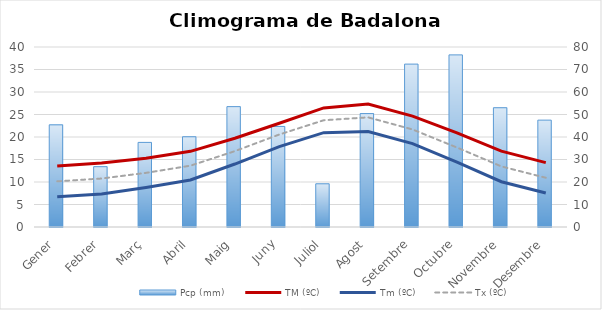
| Category | Pcp (mm) |
|---|---|
| 0 | 45.4 |
| 1 | 26.8 |
| 2 | 37.6 |
| 3 | 40.1 |
| 4 | 53.5 |
| 5 | 44.7 |
| 6 | 19.2 |
| 7 | 50.4 |
| 8 | 72.4 |
| 9 | 76.5 |
| 10 | 53 |
| 11 | 47.5 |